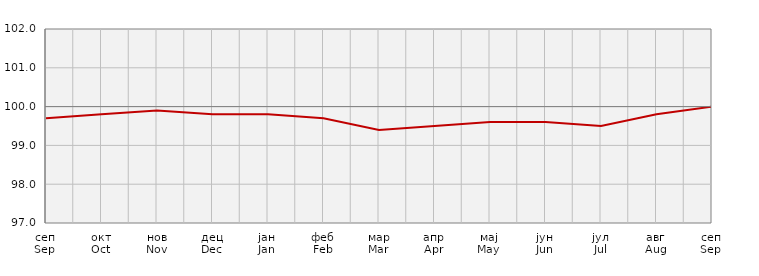
| Category | Индекси цијена произвођача
Producer price indices | Series 1 |
|---|---|---|
| сеп
Sep | 99.7 |  |
| окт
Oct | 99.8 |  |
| нов
Nov | 99.9 |  |
| дец
Dec | 99.8 |  |
| јан
Jan | 99.8 |  |
| феб
Feb | 99.7 |  |
| мар
Mar | 99.4 |  |
| апр
Apr | 99.5 |  |
| мај
May | 99.6 |  |
| јун
Jun | 99.6 |  |
| јул
Jul | 99.5 |  |
| авг
Aug | 99.8 |  |
| сеп
Sep | 100 |  |